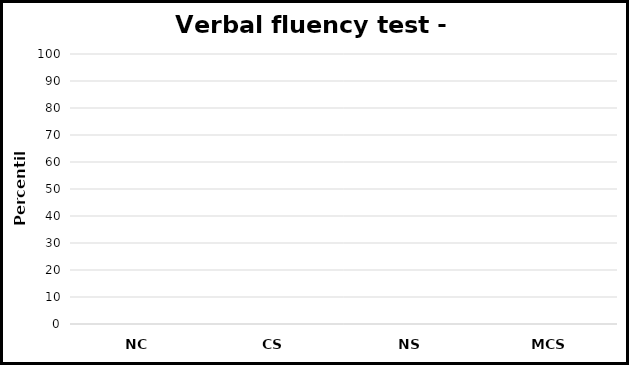
| Category | Series 0 |
|---|---|
| NC | 0 |
| CS | 0 |
| NS | 0 |
| MCS | 0 |